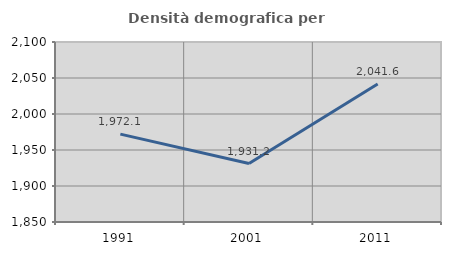
| Category | Densità demografica |
|---|---|
| 1991.0 | 1972.061 |
| 2001.0 | 1931.17 |
| 2011.0 | 2041.594 |